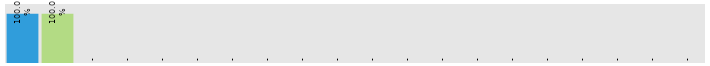
| Category | Tuesday |
|---|---|
| Accounts | 1 |
| HR | 1 |
| Lobby/Reception | 0 |
| Administration | 0 |
| Customer Support | 0 |
| Finance | 0 |
| Human Resources | 0 |
| IT | 0 |
| Marketing | 0 |
| R&D | 0 |
| Sales | 0 |